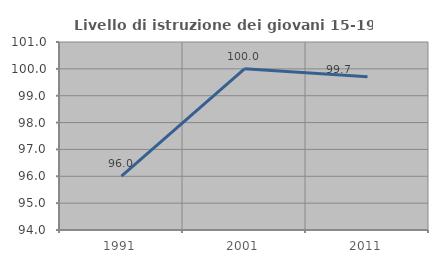
| Category | Livello di istruzione dei giovani 15-19 anni |
|---|---|
| 1991.0 | 96.009 |
| 2001.0 | 100 |
| 2011.0 | 99.703 |